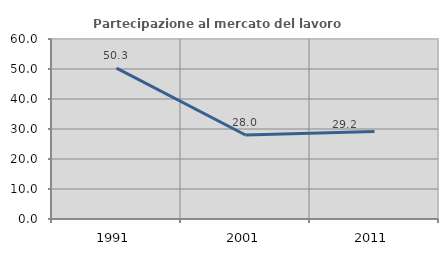
| Category | Partecipazione al mercato del lavoro  femminile |
|---|---|
| 1991.0 | 50.27 |
| 2001.0 | 28.009 |
| 2011.0 | 29.181 |